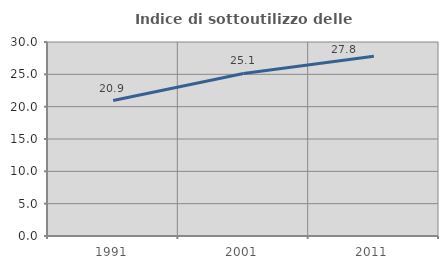
| Category | Indice di sottoutilizzo delle abitazioni  |
|---|---|
| 1991.0 | 20.94 |
| 2001.0 | 25.133 |
| 2011.0 | 27.785 |